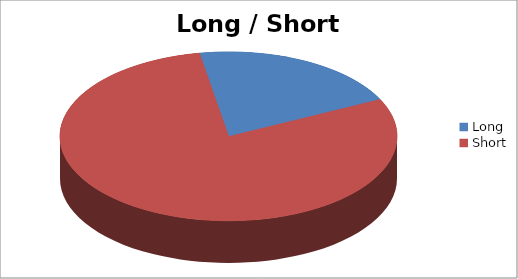
| Category | Long / Short Entries |
|---|---|
| Long | 8 |
| Short | 31 |